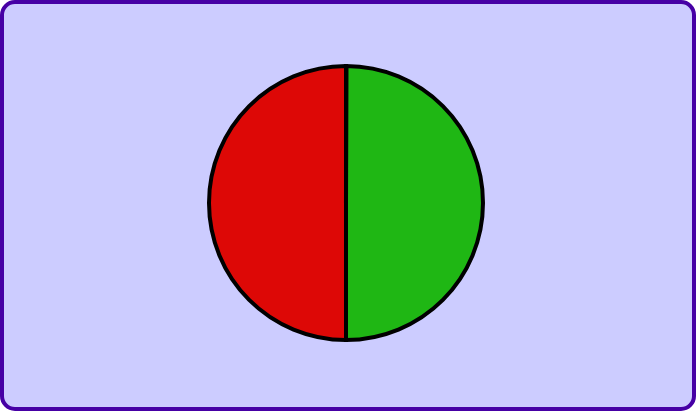
| Category | Series 0 |
|---|---|
| 0 | 1 |
| 1 | 1 |
| 2 | 0 |
| 3 | 0 |
| 4 | 0 |
| 5 | 0 |
| 6 | 0 |
| 7 | 0 |
| 8 | 0 |
| 9 | 0 |